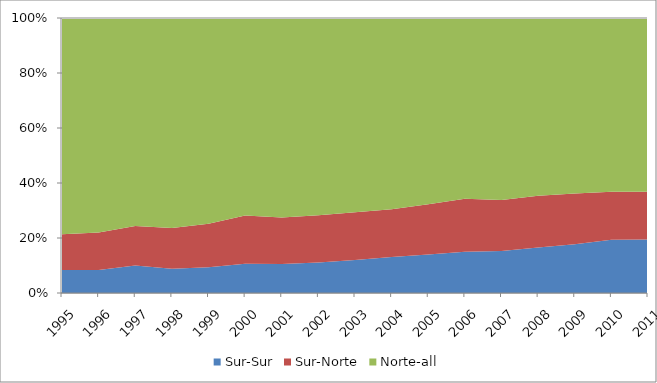
| Category | Sur-Sur | Sur-Norte | Norte-all |
|---|---|---|---|
| 1995.0 | 0.084 | 0.13 | 0.786 |
| 1996.0 | 0.084 | 0.136 | 0.78 |
| 1997.0 | 0.1 | 0.144 | 0.756 |
| 1998.0 | 0.089 | 0.148 | 0.763 |
| 1999.0 | 0.094 | 0.158 | 0.748 |
| 2000.0 | 0.106 | 0.176 | 0.718 |
| 2001.0 | 0.106 | 0.169 | 0.725 |
| 2002.0 | 0.111 | 0.172 | 0.717 |
| 2003.0 | 0.12 | 0.173 | 0.707 |
| 2004.0 | 0.13 | 0.174 | 0.696 |
| 2005.0 | 0.14 | 0.183 | 0.677 |
| 2006.0 | 0.15 | 0.192 | 0.657 |
| 2007.0 | 0.153 | 0.186 | 0.662 |
| 2008.0 | 0.165 | 0.189 | 0.646 |
| 2009.0 | 0.178 | 0.184 | 0.638 |
| 2010.0 | 0.194 | 0.175 | 0.631 |
| 2011.0 | 0.194 | 0.174 | 0.632 |